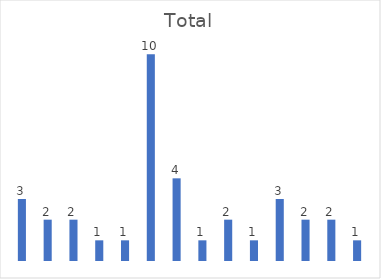
| Category | Total |
|---|---|
| Apoyar 50 Mipymes y/o emprendimientos culturales y creativos.                                                                                                                                                                     | 3 |
| Atender 15.000 animales en urgencias, brigadas médico-veterinarias, acciones de esterilización, educación y adopción.                                                                                                                                            | 2 |
| Capacitar 1.000 personas a través de procesos de formación para la participación de manera virtual y presencial.                                                                                                                  | 2 |
| Financiar 64 proyectos del sector cultural y creativo.                                                                                                                                                                            | 1 |
| Formar 1.200 personas en prevención de violencia intrafamiliar y/o violencia sexual.                                                                                                                                                                             | 1 |
| Fortalecer 120 Organizaciones, JAC e Instancias de participación ciudadana.                                                                                                                                                       | 10 |
| Fortalecer 120 Organizaciones, JAC e Instancias de participación ciudadana.                                                                                                                                                                                      | 4 |
| Promover en 50 Mipymes y/o emprendimientos la transformación empresarial y/o productiva.                                                                                                                                          | 1 |
| Realizar 24 eventos de promoción de actividades culturales.                                                                                                                                                                                                      | 2 |
| Realizar 4 acuerdos para la promover la formalización de vendedores informales a círculos económicos productivos de la ciudad.                                                                                                                                   | 1 |
| Revitalizar 60 Mipymes y/o emprendimientos potencializadas dentro de las aglomeraciones económicas que fomentan el empleo y/o nuevas actividades económicas.                                                                      | 3 |
| Vincular 1.800 personas en acciones para la prevención del feminicidio y la violencia contra la mujer.                                                                                                                                                           | 2 |
| Vincular 500 mujeres cuidadoras a estrategias de cuidado.                                                                                                                                                                                                        | 2 |
| Vincular 60 hogares y/o unidades productivas a procesos productivos y de comercialización en el sector rural.                                                                                                                                                    | 1 |